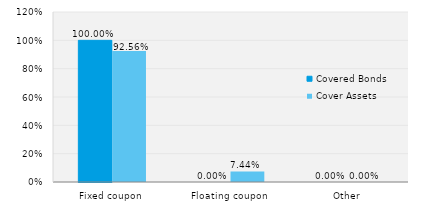
| Category | Covered Bonds | Cover Assets |
|---|---|---|
| Fixed coupon | 1 | 0.926 |
| Floating coupon | 0 | 0.074 |
| Other | 0 | 0 |